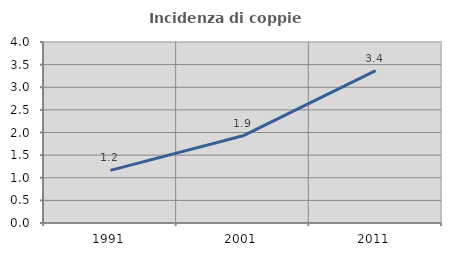
| Category | Incidenza di coppie miste |
|---|---|
| 1991.0 | 1.164 |
| 2001.0 | 1.927 |
| 2011.0 | 3.366 |